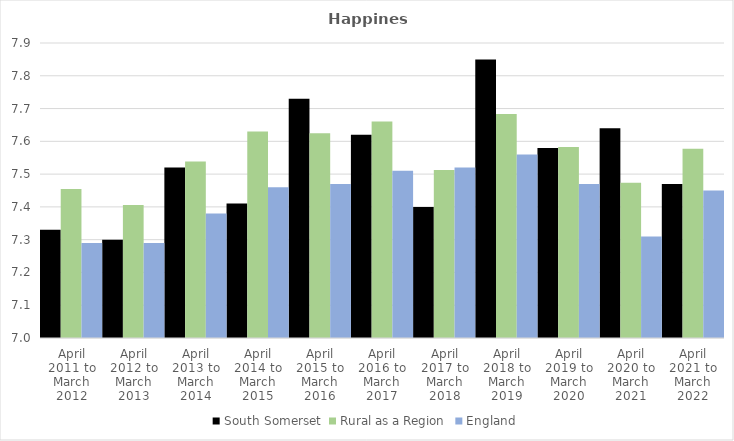
| Category | South Somerset | Rural as a Region | England |
|---|---|---|---|
| April 2011 to March 2012 | 7.33 | 7.454 | 7.29 |
| April 2012 to March 2013 | 7.3 | 7.406 | 7.29 |
| April 2013 to March 2014 | 7.52 | 7.539 | 7.38 |
| April 2014 to March 2015 | 7.41 | 7.63 | 7.46 |
| April 2015 to March 2016 | 7.73 | 7.625 | 7.47 |
| April 2016 to March 2017 | 7.62 | 7.661 | 7.51 |
| April 2017 to March 2018 | 7.4 | 7.513 | 7.52 |
| April 2018 to March 2019 | 7.85 | 7.684 | 7.56 |
| April 2019 to March 2020 | 7.58 | 7.582 | 7.47 |
| April 2020 to March 2021 | 7.64 | 7.474 | 7.31 |
| April 2021 to March 2022 | 7.47 | 7.577 | 7.45 |